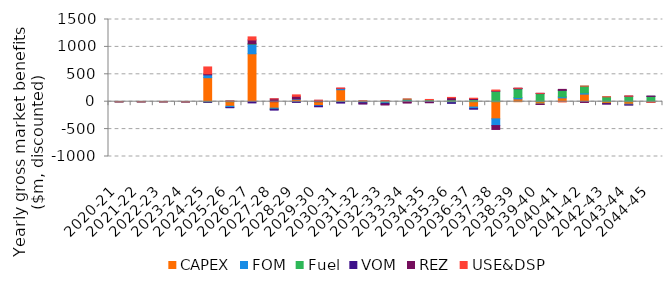
| Category | CAPEX | FOM | Fuel | VOM | REZ | USE&DSP |
|---|---|---|---|---|---|---|
| 2020-21 | -0.016 | -0.004 | -0.004 | -0.001 | -0.001 | -0.001 |
| 2021-22 | 0 | 0 | -0.004 | -0.001 | 0 | -0.001 |
| 2022-23 | -0.007 | -0.001 | -0.004 | -0.001 | 0 | -0.001 |
| 2023-24 | -0.62 | -0.164 | -0.019 | -0.009 | 0 | -0.001 |
| 2024-25 | 438.311 | 51.6 | -7.814 | -1.899 | 20.236 | 124.012 |
| 2025-26 | -83.515 | -23.34 | 10.281 | -2.417 | 0 | 1.303 |
| 2026-27 | 874.763 | 173.89 | 7.326 | -21.872 | 70.687 | 56.024 |
| 2027-28 | -118.293 | -17.718 | -2.13 | -15.436 | 51.247 | 0.077 |
| 2028-29 | 43.565 | 8.387 | -1.008 | -11.348 | 46.351 | 26.238 |
| 2029-30 | -70.706 | -10.035 | 0.817 | -11.775 | 23.456 | 2.457 |
| 2030-31 | 218.619 | 20.27 | -8.773 | -16.564 | 5.439 | 5.196 |
| 2031-32 | -17.399 | -2.971 | 12.833 | -18.801 | 0 | 3.58 |
| 2032-33 | -17.215 | -16.307 | 11.788 | -14.893 | -11.549 | 8.272 |
| 2033-34 | 17.738 | 10.235 | 18.729 | -13.032 | -11.962 | 3.216 |
| 2034-35 | 22.448 | -3.731 | 12.741 | -12.495 | -1.735 | 5.763 |
| 2035-36 | -17.093 | -2.17 | 34.51 | -10.531 | 38.245 | 5.526 |
| 2036-37 | -98.062 | -28.667 | 39.931 | -10.021 | 18.764 | 5.018 |
| 2037-38 | -313.202 | -122.357 | 191.221 | 5.084 | -70.989 | 16.637 |
| 2038-39 | 51.246 | 24.957 | 159.169 | 5.167 | 5.264 | 0.166 |
| 2039-40 | -43.199 | -4.713 | 147.925 | 4.276 | -2.393 | 0.952 |
| 2040-41 | 70.153 | 19.908 | 119.307 | 1.588 | 13.695 | -2.228 |
| 2041-42 | 138.402 | 23.063 | 122.422 | -3.052 | -10.614 | 0.755 |
| 2042-43 | -33.416 | -3.232 | 88.343 | -2.46 | -2.653 | 1.751 |
| 2043-44 | -46.534 | -12.241 | 99.641 | 0.78 | -2.477 | 4.067 |
| 2044-45 | -8.994 | -0.146 | 98.324 | 0.91 | 0.692 | -1.591 |